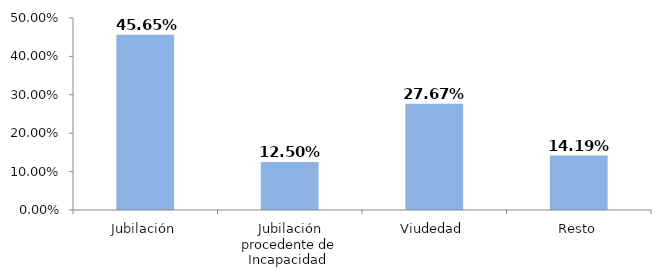
| Category | Series 0 |
|---|---|
| Jubilación | 0.456 |
| Jubilación procedente de Incapacidad  | 0.125 |
| Viudedad | 0.277 |
| Resto | 0.142 |